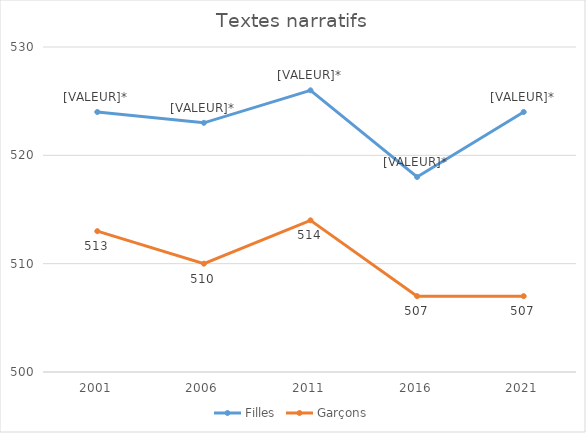
| Category | Filles | Garçons |
|---|---|---|
| 2001.0 | 524 | 513 |
| 2006.0 | 523 | 510 |
| 2011.0 | 526 | 514 |
| 2016.0 | 518 | 507 |
| 2021.0 | 524 | 507 |